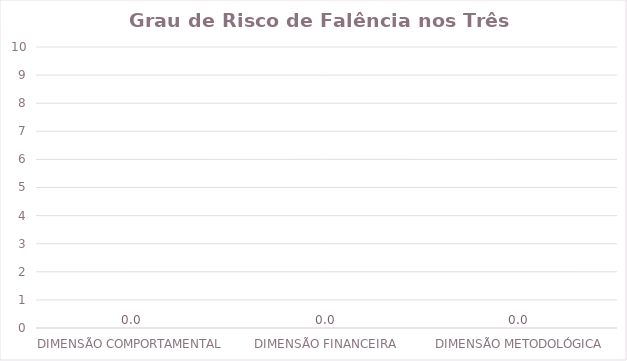
| Category | Série1 |
|---|---|
| DIMENSÃO COMPORTAMENTAL | 0 |
| DIMENSÃO FINANCEIRA | 0 |
| DIMENSÃO METODOLÓGICA | 0 |